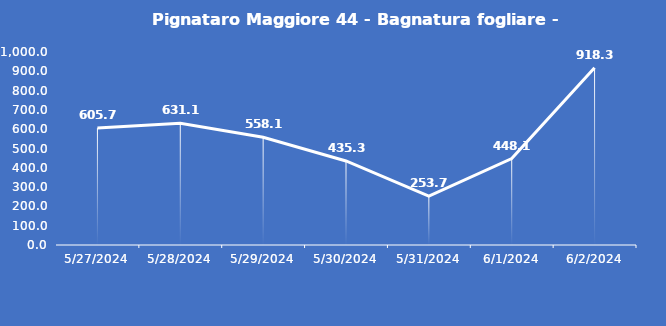
| Category | Pignataro Maggiore 44 - Bagnatura fogliare - Grezzo (min) |
|---|---|
| 5/27/24 | 605.7 |
| 5/28/24 | 631.1 |
| 5/29/24 | 558.1 |
| 5/30/24 | 435.3 |
| 5/31/24 | 253.7 |
| 6/1/24 | 448.1 |
| 6/2/24 | 918.3 |